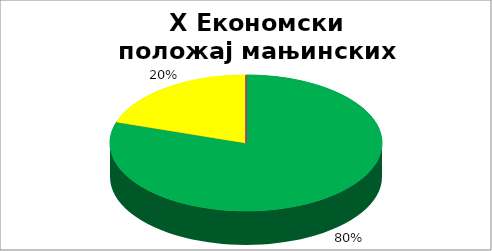
| Category | X Економски положај мањинских заједница |
|---|---|
| 0 | 0.8 |
| 1 | 0 |
| 2 | 0.2 |
| 3 | 0 |
| 4 | 0 |